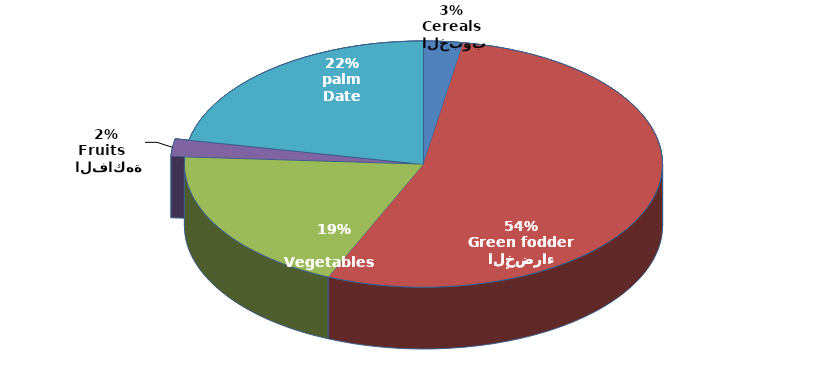
| Category | Series 0 |
|---|---|
|  الحبوب
Cereals | 0.027 |
| الأعلاف الخضراء
Green fodder | 0.539 |
| الخضروات
Vegetables     | 0.194 |
|  الفاكهة
Fruits   | 0.022 |
|  النخيل
Date palm | 0.218 |